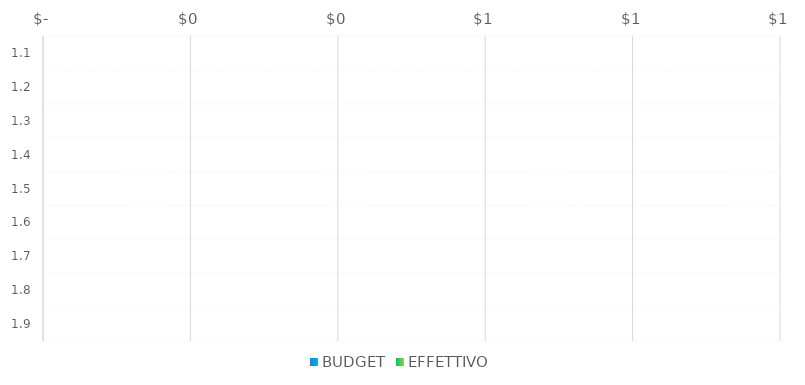
| Category | BUDGET | EFFETTIVO |
|---|---|---|
| 1.1 |  | 0 |
| 1.2 |  | 0 |
| 1.3 |  | 0 |
| 1.4 |  | 0 |
| 1.5 |  | 0 |
| 1.6 |  | 0 |
| 1.7 |  | 0 |
| 1.8 |  | 0 |
| 1.9 |  | 0 |